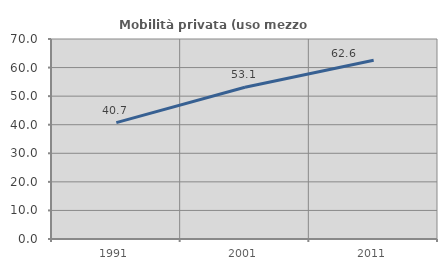
| Category | Mobilità privata (uso mezzo privato) |
|---|---|
| 1991.0 | 40.741 |
| 2001.0 | 53.136 |
| 2011.0 | 62.583 |